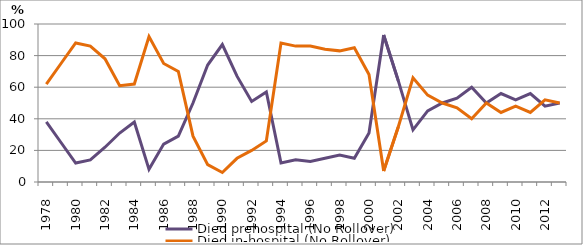
| Category | Died prehospital (No Rollover) | Died in-hospital (No Rollover) |
|---|---|---|
| 1978.0 | 38 | 62 |
| 1979.0 | 25 | 75 |
| 1980.0 | 12 | 88 |
| 1981.0 | 14 | 86 |
| 1982.0 | 22 | 78 |
| 1983.0 | 31 | 61 |
| 1984.0 | 38 | 62 |
| 1985.0 | 8 | 92 |
| 1986.0 | 24 | 75 |
| 1987.0 | 29 | 70 |
| 1988.0 | 50 | 29 |
| 1989.0 | 74 | 11 |
| 1990.0 | 87 | 6 |
| 1991.0 | 67 | 15 |
| 1992.0 | 51 | 20 |
| 1993.0 | 57 | 26 |
| 1994.0 | 12 | 88 |
| 1995.0 | 14 | 86 |
| 1996.0 | 13 | 86 |
| 1997.0 | 15 | 84 |
| 1998.0 | 17 | 83 |
| 1999.0 | 15 | 85 |
| 2000.0 | 31 | 68 |
| 2001.0 | 93 | 7 |
| 2002.0 | 64 | 35 |
| 2003.0 | 33 | 66 |
| 2004.0 | 45 | 55 |
| 2005.0 | 50 | 50 |
| 2006.0 | 53 | 47 |
| 2007.0 | 60 | 40 |
| 2008.0 | 50 | 50 |
| 2009.0 | 56 | 44 |
| 2010.0 | 52 | 48 |
| 2011.0 | 56 | 44 |
| 2012.0 | 48 | 52 |
| 2013.0 | 50 | 50 |